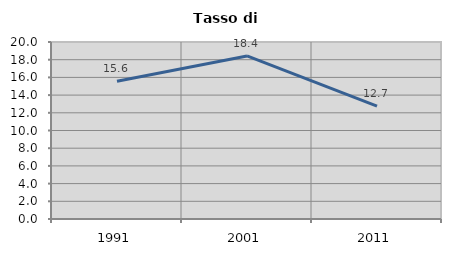
| Category | Tasso di disoccupazione   |
|---|---|
| 1991.0 | 15.556 |
| 2001.0 | 18.421 |
| 2011.0 | 12.745 |